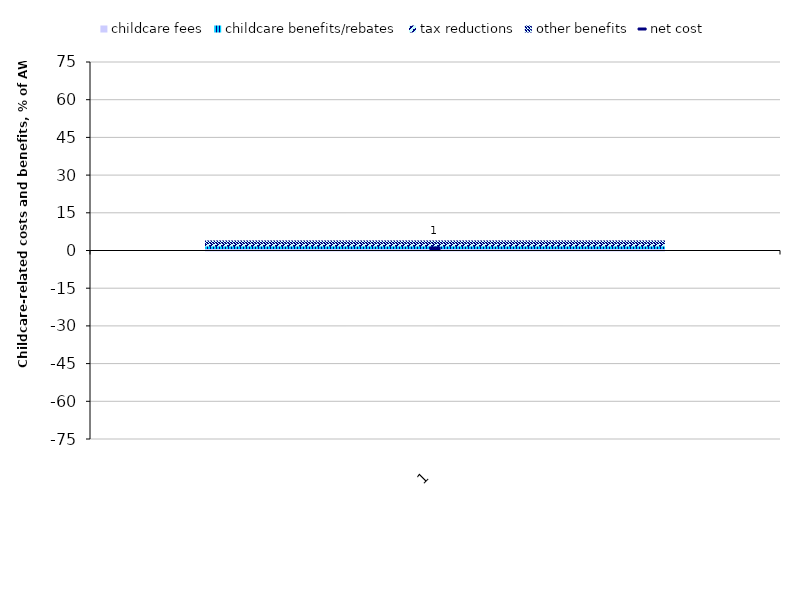
| Category | childcare fees | childcare benefits/rebates | tax reductions | other benefits |
|---|---|---|---|---|
| 0 | 1 | 1 | 1 | 1 |